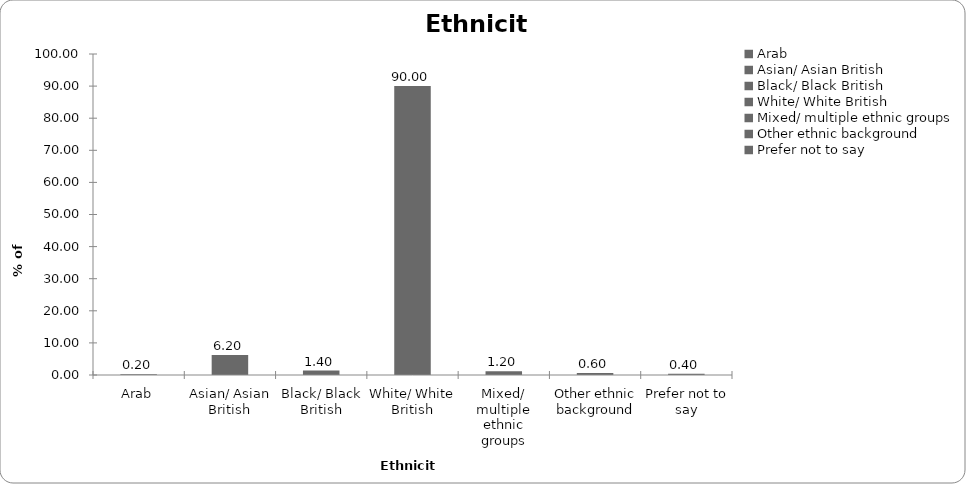
| Category | Ethnicity |
|---|---|
| Arab | 0.2 |
| Asian/ Asian British | 6.2 |
| Black/ Black British | 1.4 |
| White/ White British | 90 |
| Mixed/ multiple ethnic groups | 1.2 |
| Other ethnic background | 0.6 |
| Prefer not to say | 0.4 |